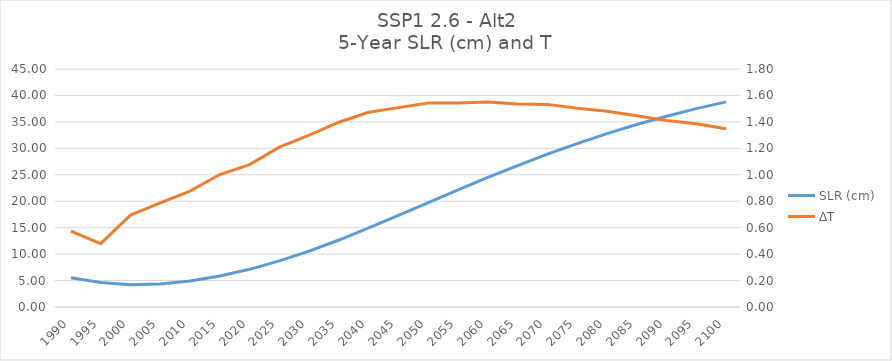
| Category | SLR (cm) |
|---|---|
| 1990.0 | 5.549 |
| 1995.0 | 4.625 |
| 2000.0 | 4.219 |
| 2005.0 | 4.353 |
| 2010.0 | 4.915 |
| 2015.0 | 5.869 |
| 2020.0 | 7.122 |
| 2025.0 | 8.712 |
| 2030.0 | 10.562 |
| 2035.0 | 12.664 |
| 2040.0 | 14.955 |
| 2045.0 | 17.328 |
| 2050.0 | 19.756 |
| 2055.0 | 22.145 |
| 2060.0 | 24.492 |
| 2065.0 | 26.734 |
| 2070.0 | 28.893 |
| 2075.0 | 30.904 |
| 2080.0 | 32.781 |
| 2085.0 | 34.502 |
| 2090.0 | 36.066 |
| 2095.0 | 37.503 |
| 2100.0 | 38.788 |